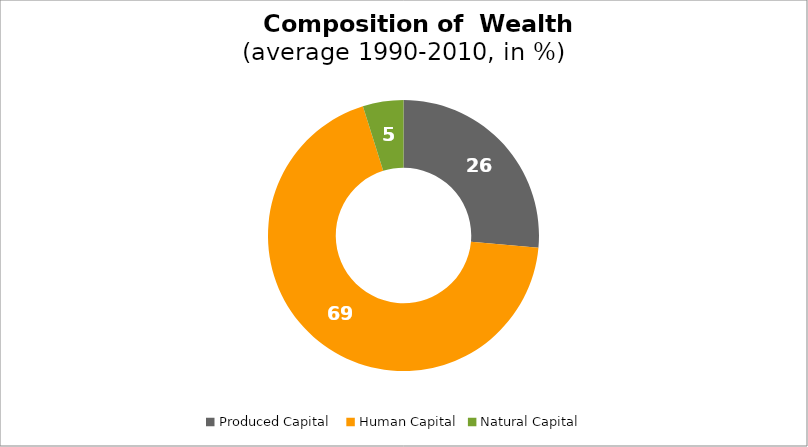
| Category | Series 0 |
|---|---|
| Produced Capital  | 26.45 |
| Human Capital | 68.706 |
| Natural Capital | 4.844 |